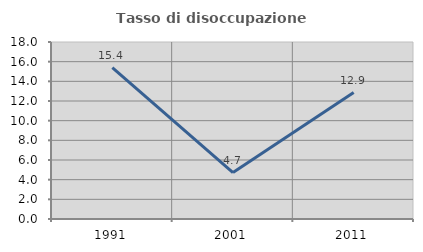
| Category | Tasso di disoccupazione giovanile  |
|---|---|
| 1991.0 | 15.385 |
| 2001.0 | 4.717 |
| 2011.0 | 12.857 |